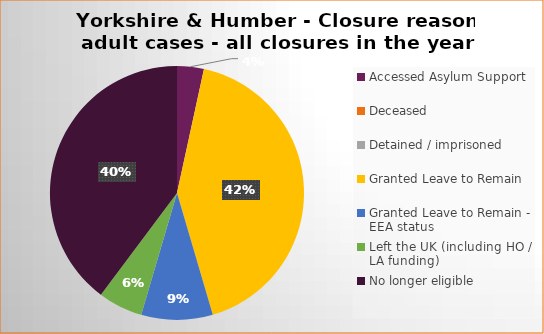
| Category | Total | Percentage |
|---|---|---|
| Accessed Asylum Support | 3 | 0.034 |
| Deceased | 0 | 0 |
| Detained / imprisoned | 0 | 0 |
| Granted Leave to Remain | 37 | 0.42 |
| Granted Leave to Remain - EEA status | 8 | 0.091 |
| Left the UK (including HO / LA funding)  | 5 | 0.057 |
| No longer eligible | 35 | 0.398 |